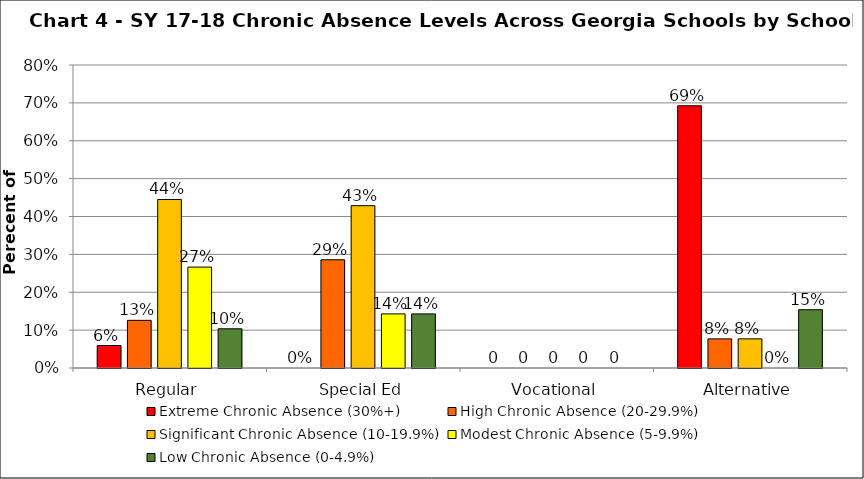
| Category | Extreme Chronic Absence (30%+) | High Chronic Absence (20-29.9%) | Significant Chronic Absence (10-19.9%) | Modest Chronic Absence (5-9.9%) | Low Chronic Absence (0-4.9%) |
|---|---|---|---|---|---|
| 0 | 0.059 | 0.126 | 0.445 | 0.266 | 0.104 |
| 1 | 0 | 0.286 | 0.429 | 0.143 | 0.143 |
| 2 | 0 | 0 | 0 | 0 | 0 |
| 3 | 0.692 | 0.077 | 0.077 | 0 | 0.154 |